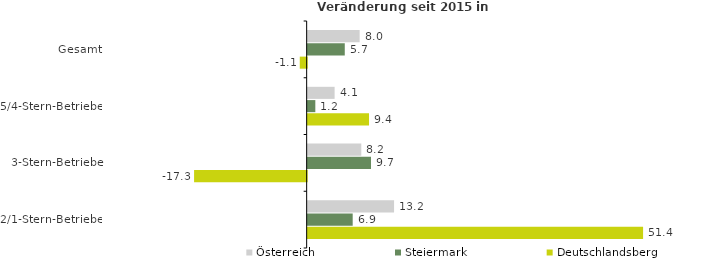
| Category | Österreich | Steiermark | Deutschlandsberg |
|---|---|---|---|
| Gesamt | 7.97 | 5.689 | -1.057 |
| 5/4-Stern-Betriebe | 4.13 | 1.174 | 9.409 |
| 3-Stern-Betriebe | 8.22 | 9.709 | -17.262 |
| 2/1-Stern-Betriebe | 13.246 | 6.904 | 51.427 |